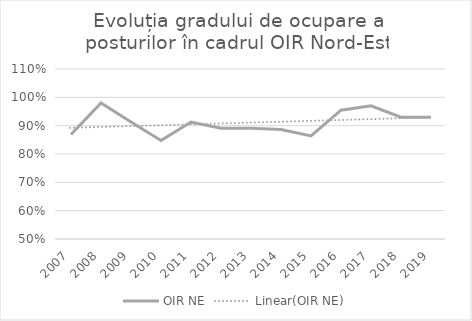
| Category | OIR NE |
|---|---|
| 2007.0 | 0.869 |
| 2008.0 | 0.98 |
| 2009.0 | 0.913 |
| 2010.0 | 0.848 |
| 2011.0 | 0.913 |
| 2012.0 | 0.891 |
| 2013.0 | 0.891 |
| 2014.0 | 0.886 |
| 2015.0 | 0.864 |
| 2016.0 | 0.954 |
| 2017.0 | 0.97 |
| 2018.0 | 0.93 |
| 2019.0 | 0.93 |